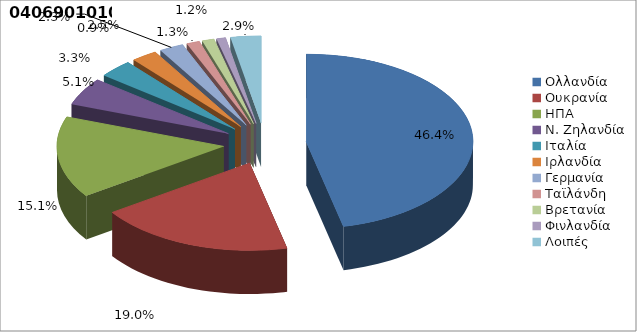
| Category | Series 0 |
|---|---|
| Ολλανδία | 0.464 |
| Ουκρανία | 0.19 |
| ΗΠΑ | 0.151 |
| Ν. Ζηλανδία | 0.051 |
| Ιταλία | 0.033 |
| Ιρλανδία | 0.025 |
| Γερμανία | 0.023 |
| Ταϊλάνδη | 0.013 |
| Βρετανία | 0.012 |
| Φινλανδία | 0.009 |
| Λοιπές | 0.029 |